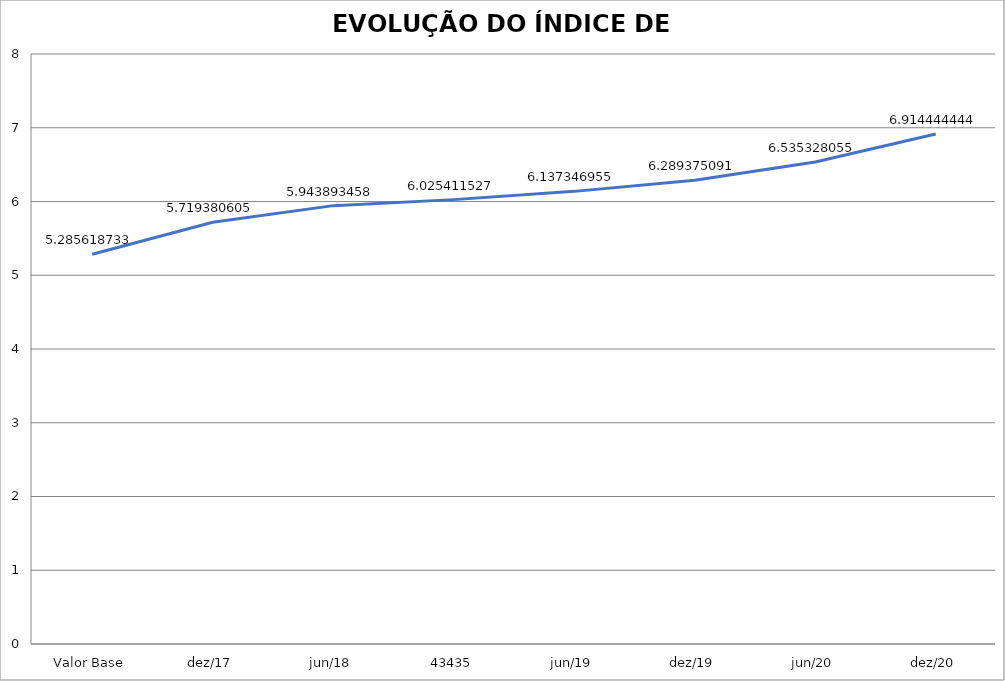
| Category | Média |
|---|---|
| Valor Base | 5.286 |
| dez/17 | 5.719 |
| jun/18 | 5.944 |
| 43435 | 6.025 |
| jun/19 | 6.137 |
| dez/19 | 6.289 |
| jun/20 | 6.535 |
| dez/20 | 6.914 |